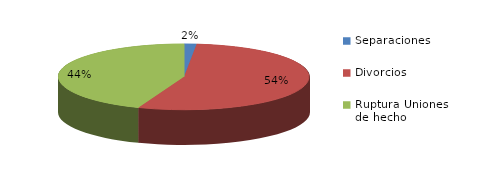
| Category | Series 0 |
|---|---|
| Separaciones | 67 |
| Divorcios | 2288 |
| Ruptura Uniones de hecho | 1860 |